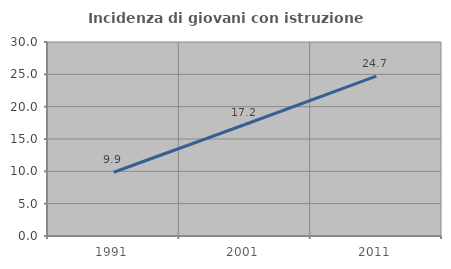
| Category | Incidenza di giovani con istruzione universitaria |
|---|---|
| 1991.0 | 9.854 |
| 2001.0 | 17.241 |
| 2011.0 | 24.731 |